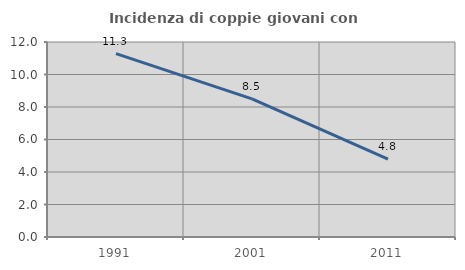
| Category | Incidenza di coppie giovani con figli |
|---|---|
| 1991.0 | 11.282 |
| 2001.0 | 8.5 |
| 2011.0 | 4.79 |